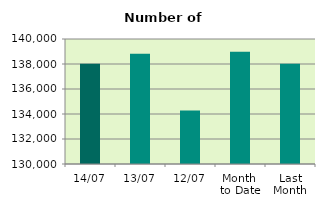
| Category | Series 0 |
|---|---|
| 14/07 | 138014 |
| 13/07 | 138812 |
| 12/07 | 134282 |
| Month 
to Date | 138980.2 |
| Last
Month | 138016.909 |